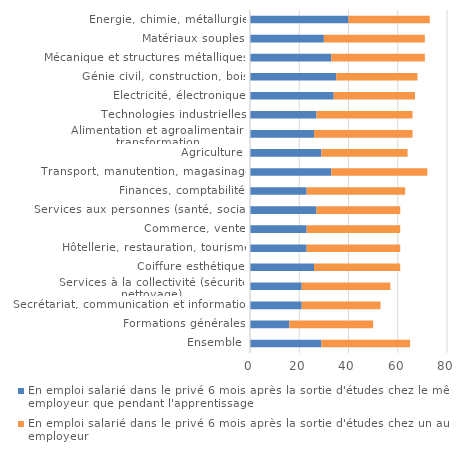
| Category | En emploi salarié dans le privé 6 mois après la sortie d'études chez le même employeur que pendant l'apprentissage | En emploi salarié dans le privé 6 mois après la sortie d'études chez un autre employeur |
|---|---|---|
| Ensemble | 29 | 36 |
| Formations générales | 16 | 34 |
| Secrétariat, communication et information | 21 | 32 |
| Services à la collectivité (sécurité, nettoyage) | 21 | 36 |
| Coiffure esthétique | 26 | 35 |
| Hôtellerie, restauration, tourisme | 23 | 38 |
| Commerce, vente | 23 | 38 |
| Services aux personnes (santé, social) | 27 | 34 |
| Finances, comptabilité | 23 | 40 |
| Transport, manutention, magasinage | 33 | 39 |
| Agriculture | 29 | 35 |
| Alimentation et agroalimentaire transformation | 26 | 40 |
| Technologies industrielles | 27 | 39 |
| Électricité, électronique | 34 | 33 |
| Génie civil, construction, bois | 35 | 33 |
| Mécanique et structures métalliques | 33 | 38 |
| Matériaux souples | 30 | 41 |
| Énergie, chimie, métallurgie | 40 | 33 |